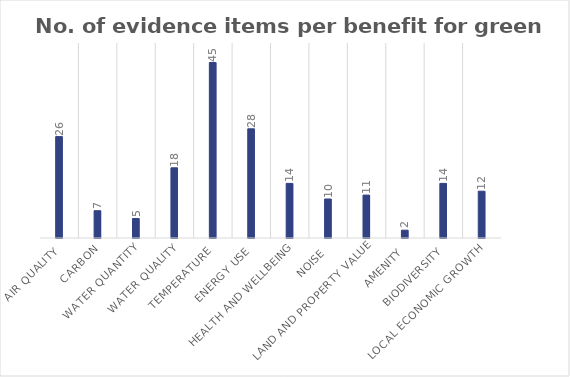
| Category | No. of evidence items |
|---|---|
| Air quality | 26 |
| Carbon | 7 |
| Water quantity | 5 |
| Water quality | 18 |
| Temperature | 45 |
| Energy use | 28 |
| Health and wellbeing | 14 |
| Noise | 10 |
| Land and property value | 11 |
| Amenity | 2 |
| Biodiversity | 14 |
| Local economic growth | 12 |